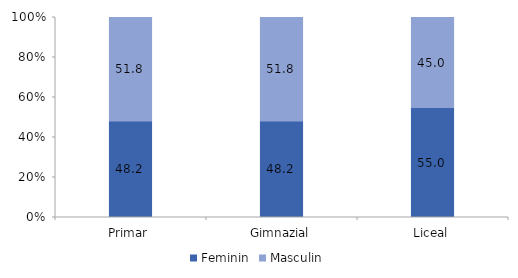
| Category | Feminin | Masculin |
|---|---|---|
| Primar | 48.2 | 51.8 |
| Gimnazial | 48.2 | 51.8 |
| Liceal | 55 | 45 |